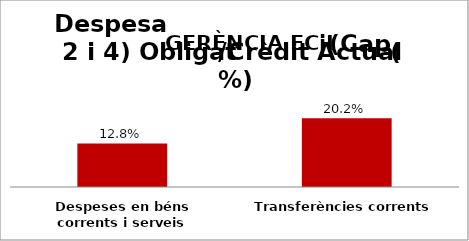
| Category | Series 0 |
|---|---|
| Despeses en béns corrents i serveis | 0.128 |
| Transferències corrents | 0.202 |